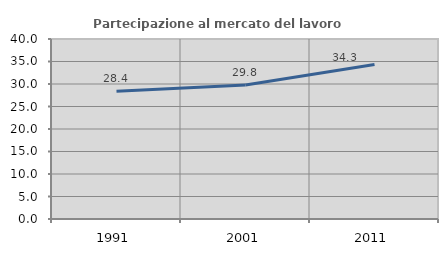
| Category | Partecipazione al mercato del lavoro  femminile |
|---|---|
| 1991.0 | 28.403 |
| 2001.0 | 29.765 |
| 2011.0 | 34.314 |